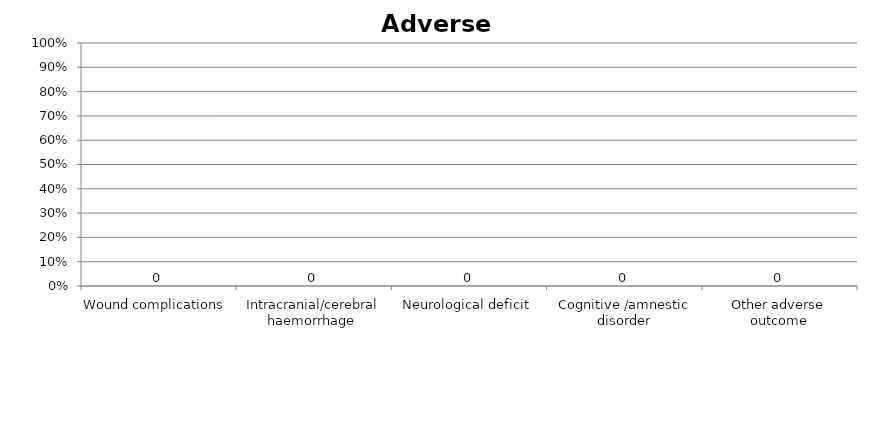
| Category | Series 0 |
|---|---|
| Wound complications  | 0 |
| Intracranial/cerebral haemorrhage  | 0 |
| Neurological deficit | 0 |
| Cognitive /amnestic disorder | 0 |
| Other adverse outcome | 0 |